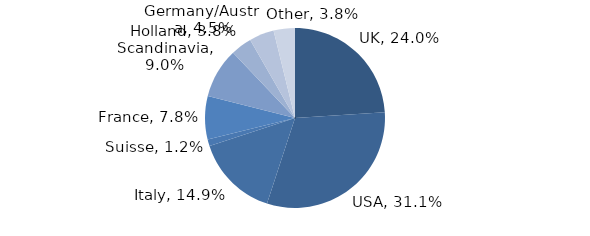
| Category | Investment Style |
|---|---|
| UK | 0.24 |
| USA | 0.311 |
| Italy | 0.149 |
| Suisse | 0.012 |
| France | 0.078 |
| Scandinavia | 0.09 |
| Holland | 0.038 |
| Germany/Austria | 0.045 |
| Other | 0.038 |